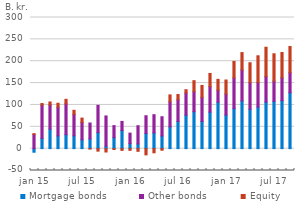
| Category | Mortgage bonds | Other bonds | Equity |
|---|---|---|---|
| jan 15 | -8.2 | 32.4 | 1.9 |
| feb 15 | 23.5 | 76 | 3.7 |
| mar 15 | 44.6 | 55.5 | 6.7 |
| apr 15 | 29 | 65.6 | 9.3 |
| may 15 | 31.9 | 70.4 | 10.5 |
| jun 15 | 29.3 | 48.8 | 9.6 |
| jul 15 | 20.2 | 39.5 | 10.2 |
| aug 15 | 22.4 | 36.3 | -0.9 |
| sep 15 | 36.6 | 62.5 | -5.7 |
| oct 15 | 5.5 | 69.3 | -7.7 |
| nov 15 | 25.2 | 27.5 | -2 |
| dec 15 | 41.3 | 21 | -4 |
| jan 16 | 11.5 | 24 | -3.9 |
| feb 16 | 10.7 | 41.7 | -6.1 |
| mar 16 | 34.6 | 40.7 | -14.2 |
| apr 16 | 36 | 41.7 | -9.5 |
| may 16 | 28.9 | 44.1 | -3.7 |
| jun 16 | 49.7 | 57.5 | 15.7 |
| jul 16 | 62.2 | 49.8 | 11.9 |
| aug 16 | 76.6 | 50.3 | 7.9 |
| sep 16 | 84.4 | 46 | 25.1 |
| oct 16 | 62 | 55.3 | 27.3 |
| nov 16 | 83.5 | 58.7 | 29.9 |
| dec 16 | 106.2 | 27.4 | 24.9 |
| jan 17 | 76.9 | 48 | 32.1 |
| feb 17 | 91.9 | 70 | 37.6 |
| mar 17 | 109 | 71.1 | 39.6 |
| apr 17 | 90.1 | 60.9 | 45.5 |
| may 17 | 95 | 56.6 | 60.8 |
| jun 17 | 106.5 | 58.5 | 67 |
| jul 17 | 108.3 | 46 | 62.7 |
| aug 17 | 109.8 | 52.3 | 57.8 |
| sep 17 | 127.8 | 46 | 59.8 |